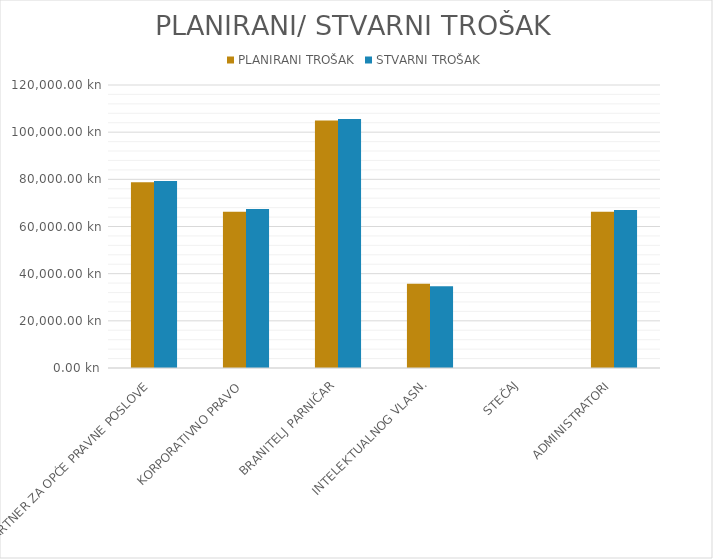
| Category | PLANIRANI TROŠAK | STVARNI TROŠAK |
|---|---|---|
| PARTNER ZA OPĆE PRAVNE POSLOVE | 78750 | 79275 |
| KORPORATIVNO PRAVO | 66250 | 67375 |
| BRANITELJ PARNIČAR | 105000 | 105600 |
| INTELEKTUALNOG VLASN. | 35750 | 34650 |
| STEČAJ | 0 | 0 |
| ADMINISTRATORI | 66250 | 67000 |